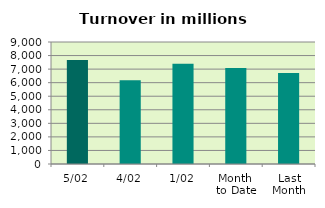
| Category | Series 0 |
|---|---|
| 5/02 | 7674.631 |
| 4/02 | 6170.165 |
| 1/02 | 7390.077 |
| Month 
to Date | 7078.291 |
| Last
Month | 6707.699 |